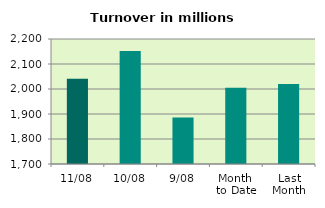
| Category | Series 0 |
|---|---|
| 11/08 | 2040.757 |
| 10/08 | 2151.876 |
| 9/08 | 1885.562 |
| Month 
to Date | 2004.514 |
| Last
Month | 2019.592 |